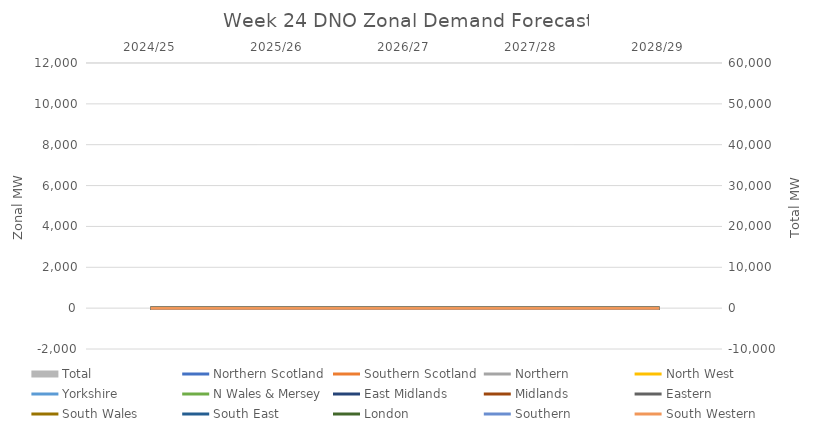
| Category | Total |
|---|---|
| 2024/25 | 0 |
| 2025/26 | 0 |
| 2026/27 | 0 |
| 2027/28 | 0 |
| 2028/29 | 0 |